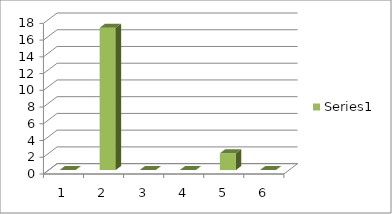
| Category | Series 0 |
|---|---|
| 0 | 0 |
| 1 | 17 |
| 2 | 0 |
| 3 | 0 |
| 4 | 2 |
| 5 | 0 |